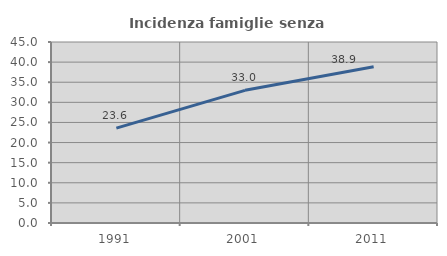
| Category | Incidenza famiglie senza nuclei |
|---|---|
| 1991.0 | 23.602 |
| 2001.0 | 32.984 |
| 2011.0 | 38.855 |